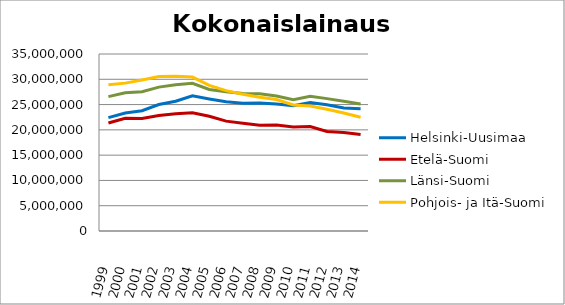
| Category | Helsinki-Uusimaa | Etelä-Suomi | Länsi-Suomi | Pohjois- ja Itä-Suomi |
|---|---|---|---|---|
| 1999.0 | 22422276 | 21366520 | 26571597 | 28904988 |
| 2000.0 | 23321249 | 22290303 | 27345815 | 29239828 |
| 2001.0 | 23774665 | 22267860 | 27551154 | 29867378 |
| 2002.0 | 25014415 | 22834770 | 28452053 | 30566257 |
| 2003.0 | 25668407 | 23204726 | 28918167 | 30614419 |
| 2004.0 | 26746056 | 23370513 | 29199046 | 30437897 |
| 2005.0 | 26114777 | 22677604 | 27997120 | 28780203 |
| 2006.0 | 25540844 | 21724244 | 27536789 | 27753580 |
| 2007.0 | 25284376 | 21316254 | 27187668 | 27051488 |
| 2008.0 | 25287843 | 20909889 | 27149793 | 26429669 |
| 2009.0 | 25124129 | 20967927 | 26692333 | 26001091 |
| 2010.0 | 24763197 | 20570723 | 25959656 | 24934449 |
| 2011.0 | 25392603 | 20664052 | 26638645 | 24732411 |
| 2012.0 | 24979463 | 19671495 | 26175528 | 24081862 |
| 2013.0 | 24335751 | 19457849 | 25648722 | 23333398 |
| 2014.0 | 24184178 | 19078612 | 25127778 | 22479540 |